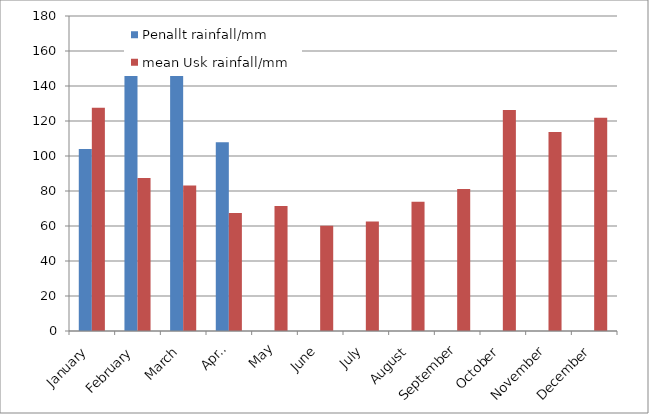
| Category | Penallt rainfall/mm | mean Usk rainfall/mm |
|---|---|---|
| January | 104 | 127.6 |
| February | 168.6 | 87.4 |
| March | 162.6 | 83.1 |
| April | 107.8 | 67.5 |
| May | 0 | 71.5 |
| June | 0 | 60.2 |
| July | 0 | 62.6 |
| August | 0 | 73.9 |
| September | 0 | 81.2 |
| October | 0 | 126.3 |
| November | 0 | 113.7 |
| December | 0 | 121.9 |